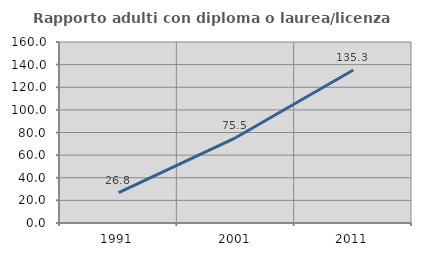
| Category | Rapporto adulti con diploma o laurea/licenza media  |
|---|---|
| 1991.0 | 26.778 |
| 2001.0 | 75.547 |
| 2011.0 | 135.278 |